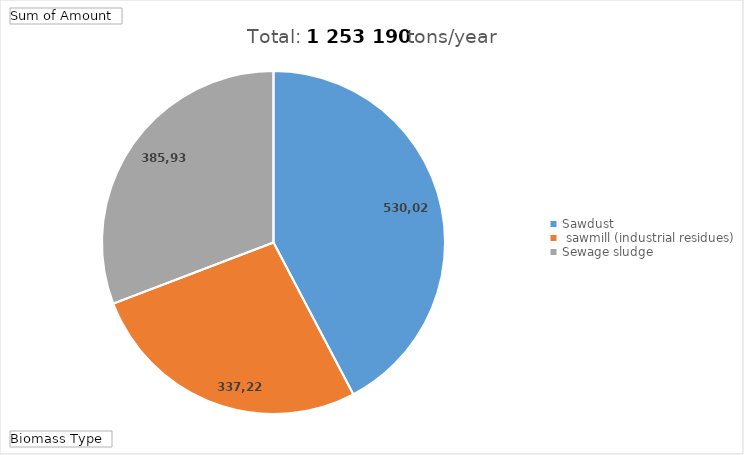
| Category | Total |
|---|---|
| Sawdust, sawmill (industrial residues) | 530028.24 |
| Sewage sludge | 337222.875 |
| Stems, branches, foliage, bark (logging residues) | 385938.902 |